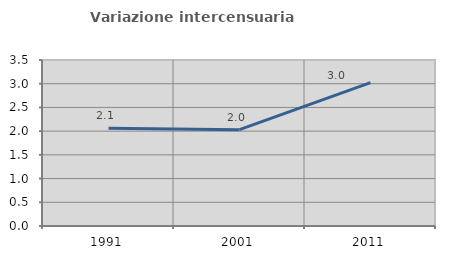
| Category | Variazione intercensuaria annua |
|---|---|
| 1991.0 | 2.06 |
| 2001.0 | 2.032 |
| 2011.0 | 3.023 |